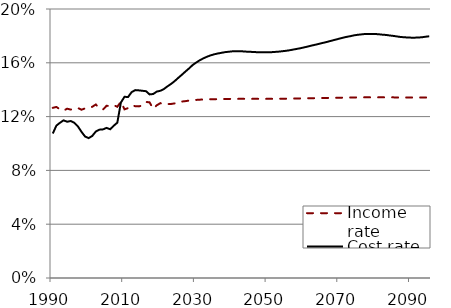
| Category | Income rate | Cost rate |
|---|---|---|
| 1990.0 | 0.126 | 0.107 |
| 1991.0 | 0.127 | 0.113 |
| 1992.0 | 0.125 | 0.115 |
| 1993.0 | 0.124 | 0.117 |
| 1994.0 | 0.126 | 0.116 |
| 1995.0 | 0.125 | 0.117 |
| 1996.0 | 0.126 | 0.115 |
| 1997.0 | 0.126 | 0.113 |
| 1998.0 | 0.125 | 0.109 |
| 1999.0 | 0.126 | 0.105 |
| 2000.0 | 0.126 | 0.104 |
| 2001.0 | 0.127 | 0.106 |
| 2002.0 | 0.129 | 0.109 |
| 2003.0 | 0.126 | 0.11 |
| 2004.0 | 0.125 | 0.11 |
| 2005.0 | 0.128 | 0.112 |
| 2006.0 | 0.128 | 0.111 |
| 2007.0 | 0.128 | 0.113 |
| 2008.0 | 0.127 | 0.116 |
| 2009.0 | 0.131 | 0.13 |
| 2010.0 | 0.125 | 0.135 |
| 2011.0 | 0.126 | 0.135 |
| 2012.0 | 0.128 | 0.138 |
| 2013.0 | 0.128 | 0.14 |
| 2014.0 | 0.128 | 0.139 |
| 2015.0 | 0.128 | 0.139 |
| 2016.0 | 0.131 | 0.139 |
| 2017.0 | 0.131 | 0.136 |
| 2018.0 | 0.126 | 0.137 |
| 2019.0 | 0.128 | 0.139 |
| 2020.0 | 0.13 | 0.139 |
| 2021.0 | 0.129 | 0.14 |
| 2022.0 | 0.129 | 0.142 |
| 2023.0 | 0.129 | 0.144 |
| 2024.0 | 0.13 | 0.146 |
| 2025.0 | 0.13 | 0.149 |
| 2026.0 | 0.131 | 0.151 |
| 2027.0 | 0.132 | 0.154 |
| 2028.0 | 0.132 | 0.156 |
| 2029.0 | 0.132 | 0.158 |
| 2030.0 | 0.132 | 0.16 |
| 2031.0 | 0.133 | 0.162 |
| 2032.0 | 0.133 | 0.163 |
| 2033.0 | 0.133 | 0.164 |
| 2034.0 | 0.133 | 0.166 |
| 2035.0 | 0.133 | 0.166 |
| 2036.0 | 0.133 | 0.167 |
| 2037.0 | 0.133 | 0.167 |
| 2038.0 | 0.133 | 0.168 |
| 2039.0 | 0.133 | 0.168 |
| 2040.0 | 0.133 | 0.168 |
| 2041.0 | 0.133 | 0.169 |
| 2042.0 | 0.133 | 0.169 |
| 2043.0 | 0.133 | 0.168 |
| 2044.0 | 0.133 | 0.168 |
| 2045.0 | 0.133 | 0.168 |
| 2046.0 | 0.133 | 0.168 |
| 2047.0 | 0.133 | 0.168 |
| 2048.0 | 0.133 | 0.168 |
| 2049.0 | 0.133 | 0.168 |
| 2050.0 | 0.133 | 0.168 |
| 2051.0 | 0.133 | 0.168 |
| 2052.0 | 0.133 | 0.168 |
| 2053.0 | 0.133 | 0.168 |
| 2054.0 | 0.133 | 0.169 |
| 2055.0 | 0.133 | 0.169 |
| 2056.0 | 0.133 | 0.169 |
| 2057.0 | 0.133 | 0.17 |
| 2058.0 | 0.134 | 0.17 |
| 2059.0 | 0.134 | 0.171 |
| 2060.0 | 0.134 | 0.171 |
| 2061.0 | 0.134 | 0.172 |
| 2062.0 | 0.134 | 0.173 |
| 2063.0 | 0.134 | 0.173 |
| 2064.0 | 0.134 | 0.174 |
| 2065.0 | 0.134 | 0.175 |
| 2066.0 | 0.134 | 0.175 |
| 2067.0 | 0.134 | 0.176 |
| 2068.0 | 0.134 | 0.177 |
| 2069.0 | 0.134 | 0.177 |
| 2070.0 | 0.134 | 0.178 |
| 2071.0 | 0.134 | 0.179 |
| 2072.0 | 0.134 | 0.179 |
| 2073.0 | 0.134 | 0.18 |
| 2074.0 | 0.134 | 0.18 |
| 2075.0 | 0.134 | 0.181 |
| 2076.0 | 0.134 | 0.181 |
| 2077.0 | 0.134 | 0.181 |
| 2078.0 | 0.134 | 0.182 |
| 2079.0 | 0.134 | 0.182 |
| 2080.0 | 0.134 | 0.181 |
| 2081.0 | 0.134 | 0.181 |
| 2082.0 | 0.134 | 0.181 |
| 2083.0 | 0.134 | 0.181 |
| 2084.0 | 0.134 | 0.18 |
| 2085.0 | 0.134 | 0.18 |
| 2086.0 | 0.134 | 0.18 |
| 2087.0 | 0.134 | 0.179 |
| 2088.0 | 0.134 | 0.179 |
| 2089.0 | 0.134 | 0.179 |
| 2090.0 | 0.134 | 0.179 |
| 2091.0 | 0.134 | 0.179 |
| 2092.0 | 0.134 | 0.179 |
| 2093.0 | 0.134 | 0.179 |
| 2094.0 | 0.134 | 0.179 |
| 2095.0 | 0.134 | 0.18 |